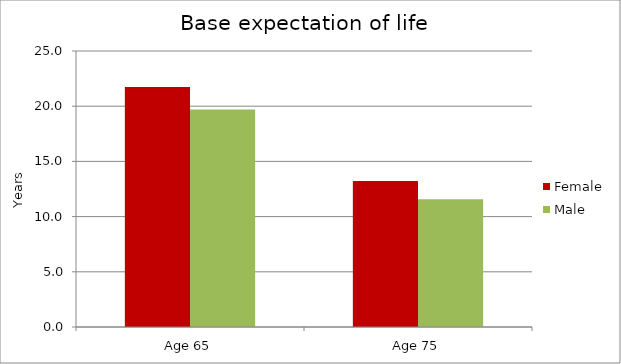
| Category | Female | Male |
|---|---|---|
| Age 65 | 21.748 | 19.7 |
| Age 75 | 13.223 | 11.582 |